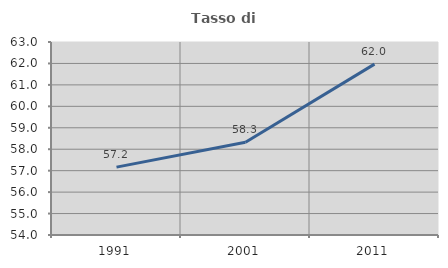
| Category | Tasso di occupazione   |
|---|---|
| 1991.0 | 57.166 |
| 2001.0 | 58.329 |
| 2011.0 | 61.968 |